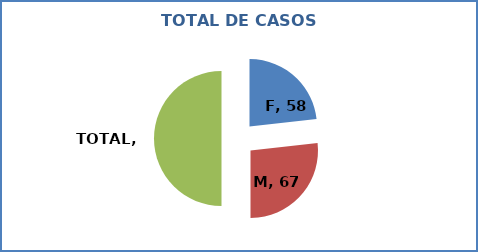
| Category | Series 0 |
|---|---|
| F | 58 |
| M | 67 |
| TOTAL | 125 |